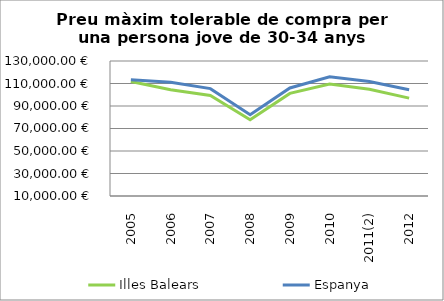
| Category | Illes Balears | Espanya |
|---|---|---|
| 2005 | 111716.64 | 113239.62 |
| 2006 | 104480.16 | 111124.38 |
| 2007 | 99341.14 | 105430.9 |
| 2008 | 77783.24 | 82268.19 |
| 2009 | 101190.78 | 106000.32 |
| 2010 | 109608.23 | 115945.98 |
| 2011(2) | 104895.44 | 111751.74 |
| 2012 | 97022.84 | 104454.55 |